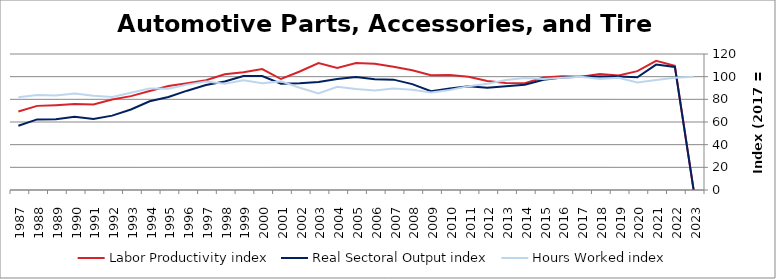
| Category | Labor Productivity index | Real Sectoral Output index | Hours Worked index |
|---|---|---|---|
| 2023.0 | 0 | 0 | 99.825 |
| 2022.0 | 109.546 | 108.594 | 99.132 |
| 2021.0 | 113.926 | 110.657 | 97.13 |
| 2020.0 | 104.911 | 99.489 | 94.832 |
| 2019.0 | 101.094 | 100.072 | 98.989 |
| 2018.0 | 102.331 | 100.225 | 97.942 |
| 2017.0 | 100 | 100 | 100 |
| 2016.0 | 100.332 | 99.35 | 99.022 |
| 2015.0 | 99.314 | 97.211 | 97.882 |
| 2014.0 | 94.126 | 92.951 | 98.752 |
| 2013.0 | 94.416 | 91.621 | 97.04 |
| 2012.0 | 96.27 | 90.207 | 93.702 |
| 2011.0 | 99.916 | 91.566 | 91.643 |
| 2010.0 | 101.497 | 89.592 | 88.27 |
| 2009.0 | 101.318 | 87.107 | 85.974 |
| 2008.0 | 105.696 | 93.444 | 88.408 |
| 2007.0 | 108.742 | 97.367 | 89.54 |
| 2006.0 | 111.482 | 97.827 | 87.752 |
| 2005.0 | 111.997 | 99.733 | 89.05 |
| 2004.0 | 107.586 | 97.971 | 91.063 |
| 2003.0 | 111.941 | 95.333 | 85.164 |
| 2002.0 | 104.55 | 94.261 | 90.159 |
| 2001.0 | 97.931 | 93.852 | 95.834 |
| 2000.0 | 106.732 | 100.508 | 94.168 |
| 1999.0 | 103.898 | 100.502 | 96.731 |
| 1998.0 | 102.127 | 95.804 | 93.809 |
| 1997.0 | 96.804 | 92.665 | 95.725 |
| 1996.0 | 94.27 | 87.643 | 92.971 |
| 1995.0 | 91.766 | 82.001 | 89.358 |
| 1994.0 | 87.278 | 78.255 | 89.662 |
| 1993.0 | 82.822 | 71.015 | 85.744 |
| 1992.0 | 79.911 | 65.632 | 82.131 |
| 1991.0 | 75.411 | 62.652 | 83.081 |
| 1990.0 | 75.838 | 64.629 | 85.22 |
| 1989.0 | 74.884 | 62.49 | 83.45 |
| 1988.0 | 74.232 | 62.277 | 83.895 |
| 1987.0 | 69.199 | 56.634 | 81.843 |